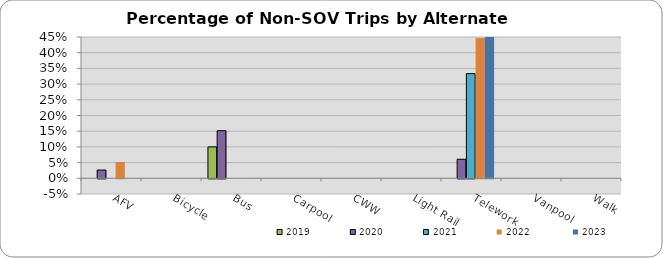
| Category | 2019 | 2020 | 2021 | 2022 | 2023 |
|---|---|---|---|---|---|
| AFV | 0 | 0.026 | 0 | 0.052 | 0 |
| Bicycle | 0 | 0 | 0 | 0 | 0 |
| Bus | 0.1 | 0.152 | 0 | 0 | 0 |
| Carpool | 0 | 0 | 0 | 0 | 0 |
| CWW | 0 | 0 | 0 | 0 | 0 |
| Light Rail | 0 | 0 | 0 | 0 | 0 |
| Telework | 0 | 0.061 | 0.333 | 0.446 | 0.458 |
| Vanpool | 0 | 0 | 0 | 0 | 0 |
| Walk | 0 | 0 | 0 | 0 | 0 |